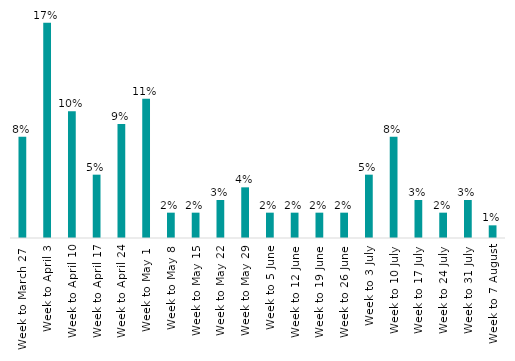
| Category | Series 0 |
|---|---|
| Week to March 27  | 0.08 |
| Week to April 3 | 0.17 |
| Week to April 10 | 0.1 |
| Week to April 17 | 0.05 |
| Week to April 24 | 0.09 |
| Week to May 1  | 0.11 |
| Week to May 8 | 0.02 |
| Week to May 15 | 0.02 |
| Week to May 22 | 0.03 |
| Week to May 29 | 0.04 |
| Week to 5 June | 0.02 |
| Week to 12 June | 0.02 |
| Week to 19 June | 0.02 |
| Week to 26 June | 0.02 |
| Week to 3 July | 0.05 |
| Week to 10 July | 0.08 |
| Week to 17 July | 0.03 |
| Week to 24 July | 0.02 |
| Week to 31 July | 0.03 |
| Week to 7 August | 0.01 |